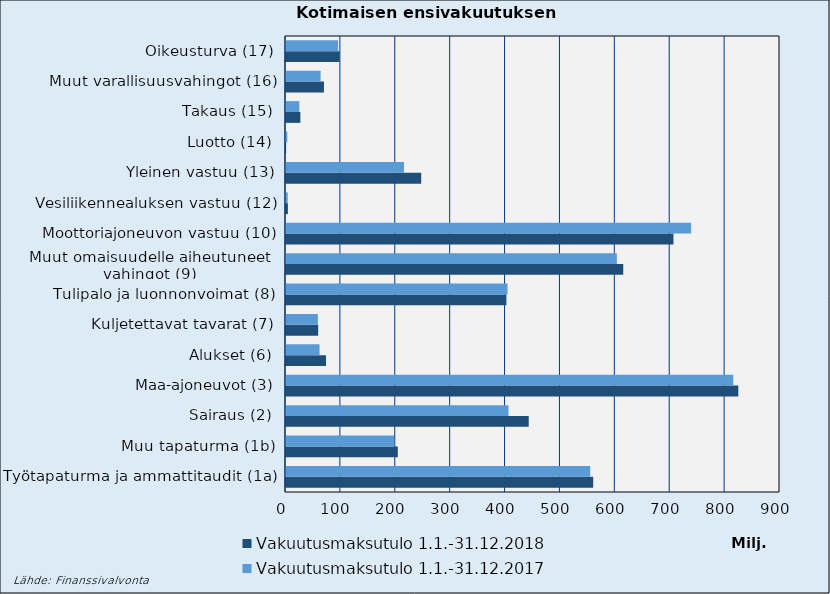
| Category | Vakuutusmaksutulo |
|---|---|
| Työtapaturma ja ammattitaudit (1a) | 554225.637 |
| Muu tapaturma (1b) | 196846.354 |
| Sairaus (2) | 405364.067 |
| Maa-ajoneuvot (3) | 814938.211 |
| Alukset (6) | 61117.599 |
| Kuljetettavat tavarat (7) | 58074.63 |
| Tulipalo ja luonnonvoimat (8) | 403686.09 |
| Muut omaisuudelle aiheutuneet 
vahingot (9) | 602744.738 |
| Moottoriajoneuvon vastuu (10) | 738080.982 |
| Vesiliikennealuksen vastuu (12) | 3152.309 |
| Yleinen vastuu (13) | 215008.232 |
| Luotto (14) | 2376.358 |
| Takaus (15) | 24324.75 |
| Muut varallisuusvahingot (16) | 63027.609 |
| Oikeusturva (17) | 94921.496 |